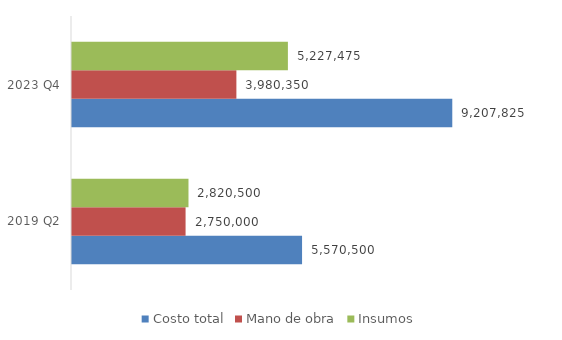
| Category | Costo total | Mano de obra | Insumos |
|---|---|---|---|
| 2019 Q2 | 5570500 | 2750000 | 2820500 |
| 2023 Q4 | 9207824.733 | 3980350 | 5227474.733 |